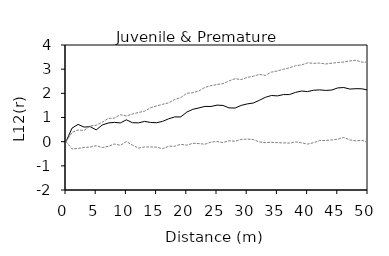
| Category | E12- | E12+ | Expect |
|---|---|---|---|
| 0.0 | 0 | 0 | 0 |
| 1.0 | 0.561 | -0.302 | 0.383 |
| 2.0 | 0.715 | -0.28 | 0.481 |
| 3.0 | 0.604 | -0.24 | 0.466 |
| 4.0 | 0.622 | -0.224 | 0.653 |
| 5.0 | 0.487 | -0.167 | 0.68 |
| 6.0 | 0.689 | -0.243 | 0.801 |
| 7.0 | 0.773 | -0.196 | 0.964 |
| 8.0 | 0.799 | -0.098 | 0.975 |
| 9.0 | 0.774 | -0.151 | 1.114 |
| 10.0 | 0.904 | 0.002 | 1.065 |
| 11.0 | 0.785 | -0.141 | 1.145 |
| 12.0 | 0.777 | -0.266 | 1.208 |
| 13.0 | 0.838 | -0.22 | 1.263 |
| 14.0 | 0.795 | -0.216 | 1.402 |
| 15.0 | 0.782 | -0.229 | 1.479 |
| 16.0 | 0.841 | -0.29 | 1.546 |
| 17.0 | 0.946 | -0.19 | 1.607 |
| 18.0 | 1.023 | -0.19 | 1.748 |
| 19.0 | 1.023 | -0.109 | 1.825 |
| 20.0 | 1.224 | -0.145 | 2.004 |
| 21.0 | 1.339 | -0.067 | 2.022 |
| 22.0 | 1.395 | -0.079 | 2.103 |
| 23.0 | 1.459 | -0.106 | 2.246 |
| 24.0 | 1.456 | -0.016 | 2.317 |
| 25.0 | 1.513 | 0.006 | 2.363 |
| 26.0 | 1.499 | -0.036 | 2.403 |
| 27.0 | 1.396 | 0.039 | 2.513 |
| 28.0 | 1.392 | 0.016 | 2.606 |
| 29.0 | 1.501 | 0.093 | 2.568 |
| 30.0 | 1.562 | 0.104 | 2.658 |
| 31.0 | 1.599 | 0.09 | 2.707 |
| 32.0 | 1.709 | -0.01 | 2.783 |
| 33.0 | 1.834 | -0.041 | 2.744 |
| 34.0 | 1.911 | -0.024 | 2.876 |
| 35.0 | 1.894 | -0.042 | 2.927 |
| 36.0 | 1.948 | -0.05 | 2.995 |
| 37.0 | 1.949 | -0.06 | 3.055 |
| 38.0 | 2.04 | -0.008 | 3.143 |
| 39.0 | 2.095 | -0.048 | 3.176 |
| 40.0 | 2.073 | -0.101 | 3.26 |
| 41.0 | 2.128 | -0.04 | 3.245 |
| 42.0 | 2.143 | 0.049 | 3.251 |
| 43.0 | 2.12 | 0.048 | 3.215 |
| 44.0 | 2.137 | 0.072 | 3.246 |
| 45.0 | 2.224 | 0.102 | 3.277 |
| 46.0 | 2.24 | 0.177 | 3.296 |
| 47.0 | 2.176 | 0.073 | 3.343 |
| 48.0 | 2.192 | 0.035 | 3.369 |
| 49.0 | 2.188 | 0.056 | 3.29 |
| 50.0 | 2.134 | -0.038 | 3.293 |